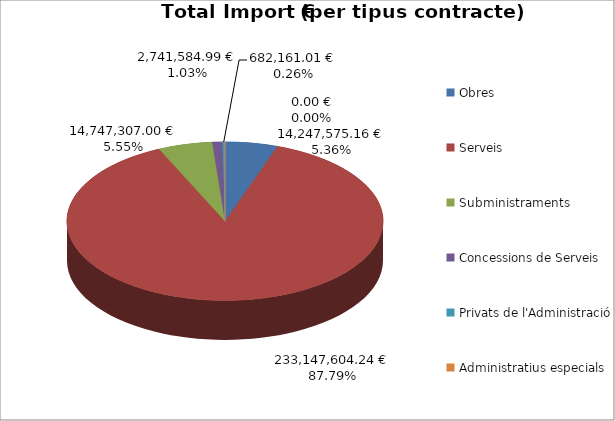
| Category | Total preu              (amb iva) |
|---|---|
| Obres | 14247575.16 |
| Serveis | 233147604.24 |
| Subministraments | 14747307 |
| Concessions de Serveis | 2741584.99 |
| Privats de l'Administració | 682161.01 |
| Administratius especials | 0 |